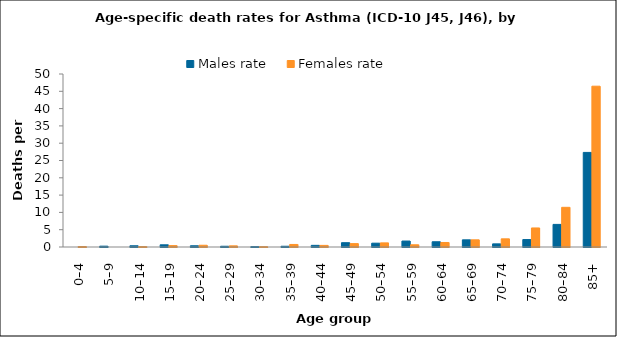
| Category | Males rate | Females rate |
|---|---|---|
| 0–4 | 0 | 0.136 |
| 5–9 | 0.241 | 0 |
| 10–14 | 0.356 | 0.126 |
| 15–19 | 0.632 | 0.404 |
| 20–24 | 0.355 | 0.505 |
| 25–29 | 0.216 | 0.332 |
| 30–34 | 0.106 | 0.103 |
| 35–39 | 0.213 | 0.734 |
| 40–44 | 0.475 | 0.463 |
| 45–49 | 1.245 | 0.976 |
| 50–54 | 1.106 | 1.191 |
| 55–59 | 1.723 | 0.641 |
| 60–64 | 1.516 | 1.304 |
| 65–69 | 2.072 | 2.072 |
| 70–74 | 0.907 | 2.358 |
| 75–79 | 2.15 | 5.505 |
| 80–84 | 6.531 | 11.468 |
| 85+ | 27.338 | 46.475 |